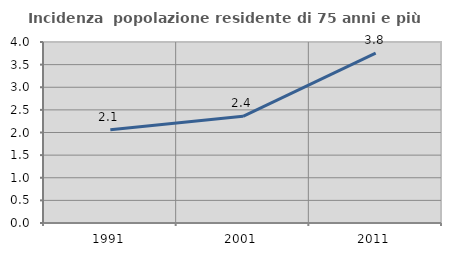
| Category | Incidenza  popolazione residente di 75 anni e più |
|---|---|
| 1991.0 | 2.063 |
| 2001.0 | 2.357 |
| 2011.0 | 3.756 |